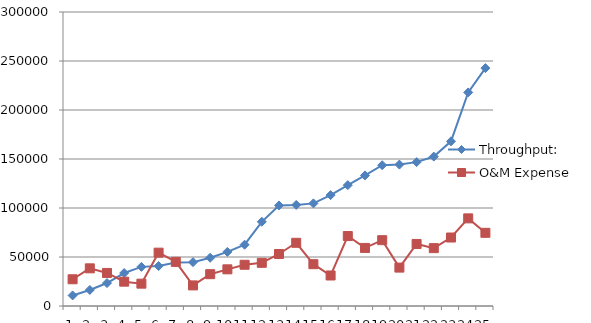
| Category | Throughput: | O&M Expense |
|---|---|---|
| 0 | 10785.1 | 27267.71 |
| 1 | 16363.44 | 38429.53 |
| 2 | 23419.28 | 33732.4 |
| 3 | 33640.83 | 24828.04 |
| 4 | 39924.56 | 22786.53 |
| 5 | 40795.9 | 54427.86 |
| 6 | 44353.69 | 45039.31 |
| 7 | 44717.31 | 21008.65 |
| 8 | 49214.7 | 32484.12 |
| 9 | 55221.48 | 37406.24 |
| 10 | 62559.5 | 42066.6 |
| 11 | 85918.58 | 44053.56 |
| 12 | 102600.95 | 53067.45 |
| 13 | 103131.58 | 64505.89 |
| 14 | 104708.23 | 42662.61 |
| 15 | 113151.06 | 31131.72 |
| 16 | 123325 | 71387.22 |
| 17 | 133238.08 | 59257.35 |
| 18 | 143656.02 | 67155.82 |
| 19 | 144291.16 | 39189.17 |
| 20 | 146789.1 | 63306.08 |
| 21 | 152486.42 | 59048.78 |
| 22 | 168024.87 | 69874.13 |
| 23 | 217936.05 | 89426.15 |
| 24 | 242723.97 | 74675.83 |